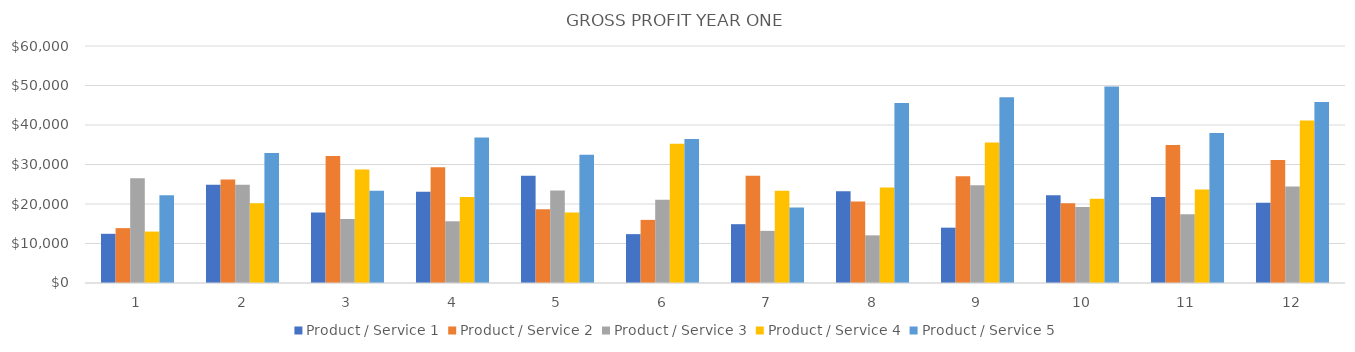
| Category | Product / Service 1 | Product / Service 2 | Product / Service 3 | Product / Service 4 | Product / Service 5 |
|---|---|---|---|---|---|
| 0 | 12453 | 13896 | 26541 | 13024 | 22200 |
| 1 | 24899 | 26232 | 24858 | 20218 | 32880 |
| 2 | 17822 | 32152 | 16218 | 28743 | 23385 |
| 3 | 23107.5 | 29287.5 | 15623 | 21766.5 | 36815.5 |
| 4 | 27131 | 18660 | 23400.5 | 17871 | 32465.5 |
| 5 | 12369.5 | 15982.5 | 21063 | 35238 | 36438.5 |
| 6 | 14891.5 | 27142.5 | 13200.5 | 23331 | 19140 |
| 7 | 23211.5 | 20602.5 | 12061.5 | 24202.5 | 45559 |
| 8 | 14007.5 | 27052.5 | 24726.5 | 35595 | 47052.5 |
| 9 | 22218 | 20160 | 19233 | 21329 | 49770 |
| 10 | 21780 | 34920 | 17376 | 23647 | 38000 |
| 11 | 20340 | 31170 | 24420 | 41158 | 45840 |